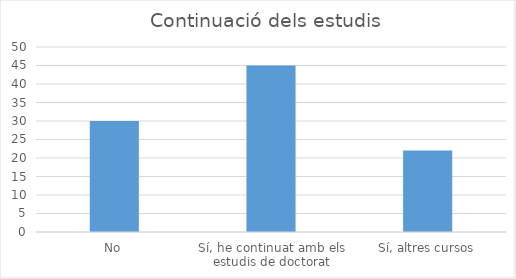
| Category | Series 0 |
|---|---|
| No | 30 |
| Sí, he continuat amb els estudis de doctorat | 45 |
| Sí, altres cursos | 22 |